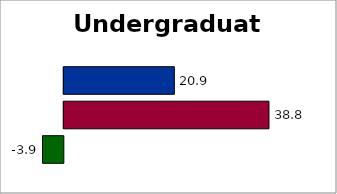
| Category | Series 2 | SREB states | 50 states and D.C. |
|---|---|---|---|
| 0 | -3.94 | 38.829 | 20.917 |